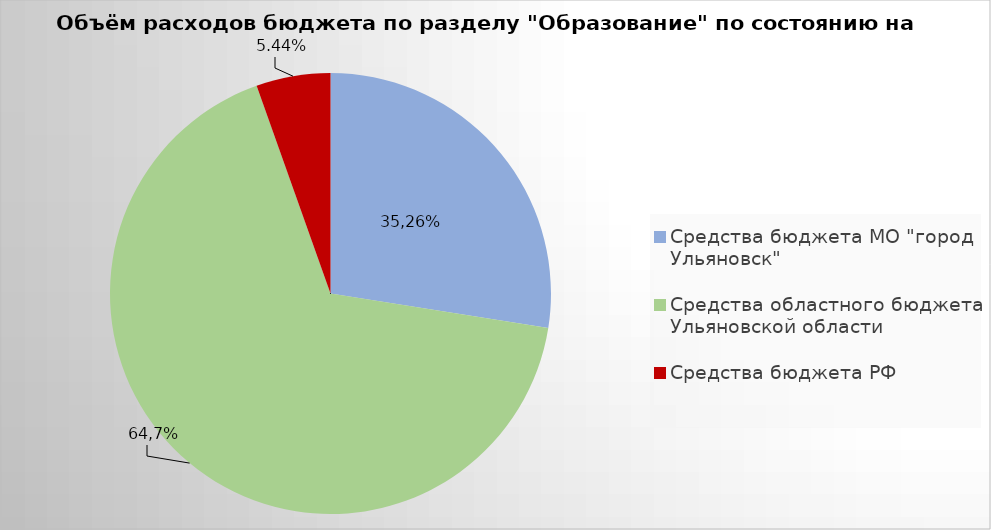
| Category | Series 0 |
|---|---|
| Средства бюджета МО "город Ульяновск" | 2171340.12 |
| Средства областного бюджета Ульяновской области | 5294480.98 |
| Средства бюджета РФ | 429251.76 |